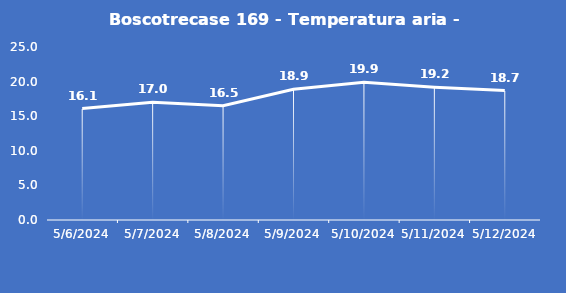
| Category | Boscotrecase 169 - Temperatura aria - Grezzo (°C) |
|---|---|
| 5/6/24 | 16.1 |
| 5/7/24 | 17 |
| 5/8/24 | 16.5 |
| 5/9/24 | 18.9 |
| 5/10/24 | 19.9 |
| 5/11/24 | 19.2 |
| 5/12/24 | 18.7 |